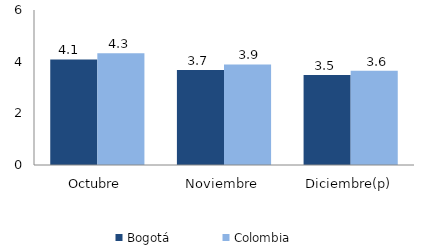
| Category | Bogotá | Colombia |
|---|---|---|
| Octubre | 4.085 | 4.324 |
| Noviembre | 3.673 | 3.895 |
| Diciembre(p) | 3.486 | 3.645 |